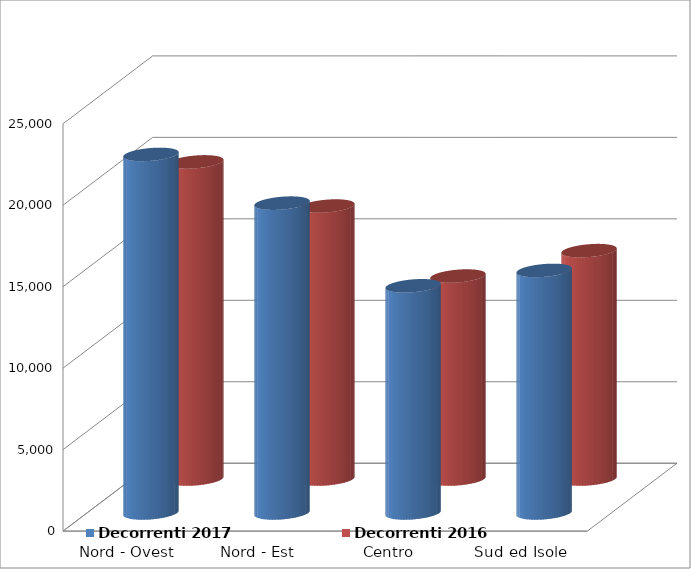
| Category | Decorrenti 2017 | Decorrenti 2016 |
|---|---|---|
| Nord - Ovest | 22005 | 19464 |
| Nord - Est | 19015 | 16754 |
| Centro | 13942 | 12458 |
| Sud ed Isole | 14885 | 14017 |